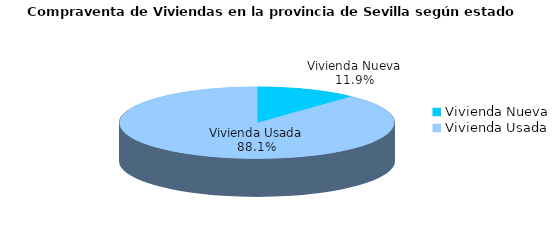
| Category | Series 0 | Series 1 |
|---|---|---|
| Vivienda Nueva | 126 | 0.119 |
| Vivienda Usada | 931 | 0.881 |